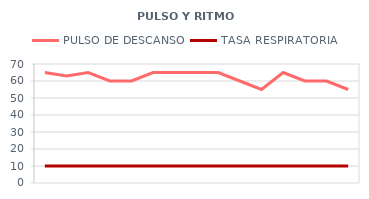
| Category | PULSO DE DESCANSO | TASA RESPIRATORIA |
|---|---|---|
| 6/1/12 | 65 | 10 |
| 6/2/12 | 63 | 10 |
| 6/3/12 | 65 | 10 |
| 6/4/12 | 60 | 10 |
| 6/5/12 | 60 | 10 |
| 6/6/12 | 65 | 10 |
| 6/7/12 | 65 | 10 |
| 6/8/12 | 65 | 10 |
| 6/9/12 | 65 | 10 |
| 6/10/12 | 60 | 10 |
| 6/11/12 | 55 | 10 |
| 6/12/12 | 65 | 10 |
| 6/13/12 | 60 | 10 |
| 6/14/12 | 60 | 10 |
| 6/15/12 | 55 | 10 |